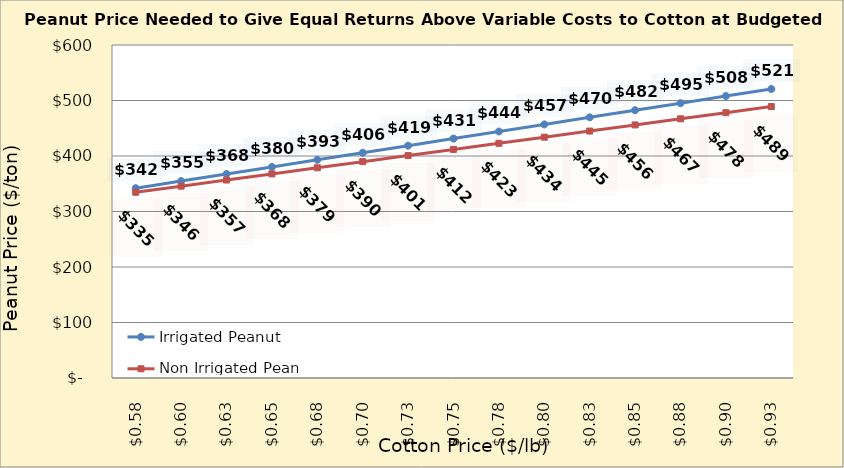
| Category | Irrigated Peanut | Non Irrigated Peanut |
|---|---|---|
| 0.5749999999999998 | 342.033 | 334.663 |
| 0.5999999999999999 | 354.799 | 345.692 |
| 0.6249999999999999 | 367.565 | 356.721 |
| 0.6499999999999999 | 380.331 | 367.751 |
| 0.6749999999999999 | 393.097 | 378.78 |
| 0.7 | 405.863 | 389.81 |
| 0.725 | 418.629 | 400.839 |
| 0.75 | 431.395 | 411.869 |
| 0.775 | 444.161 | 422.898 |
| 0.8 | 456.927 | 433.927 |
| 0.8250000000000001 | 469.693 | 444.957 |
| 0.8500000000000001 | 482.459 | 455.986 |
| 0.8750000000000001 | 495.225 | 467.016 |
| 0.9000000000000001 | 507.991 | 478.045 |
| 0.9250000000000002 | 520.757 | 489.074 |